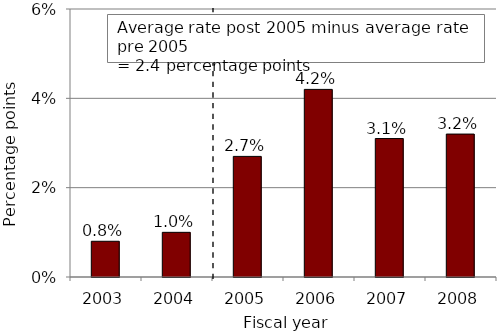
| Category | Bars |
|---|---|
| 2003.0 | 0.8 |
| 2004.0 | 1 |
| 2005.0 | 2.7 |
| 2006.0 | 4.2 |
| 2007.0 | 3.1 |
| 2008.0 | 3.2 |